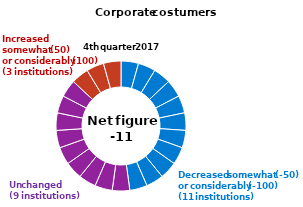
| Category | Series 0 |
|---|---|
| 0 | 1 |
| 1 | 1 |
| 2 | 1 |
| 3 | 1 |
| 4 | 1 |
| 5 | 1 |
| 6 | 1 |
| 7 | 1 |
| 8 | 1 |
| 9 | 1 |
| 10 | 1 |
| 11 | 1 |
| 12 | 1 |
| 13 | 1 |
| 14 | 1 |
| 15 | 1 |
| 16 | 1 |
| 17 | 1 |
| 18 | 1 |
| 19 | 1 |
| 20 | 1 |
| 21 | 1 |
| 22 | 1 |